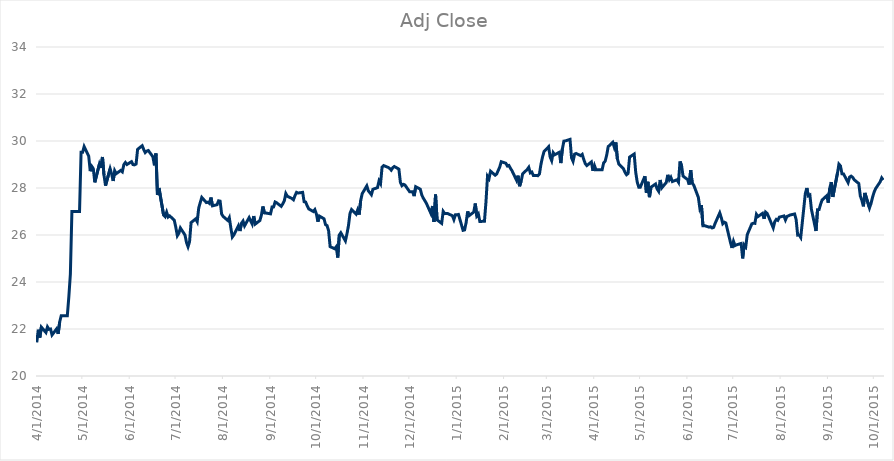
| Category | Adj Close |
|---|---|
| 4/1/14 | 21.43 |
| 4/2/14 | 21.97 |
| 4/3/14 | 21.635 |
| 4/4/14 | 22.08 |
| 4/7/14 | 21.85 |
| 4/8/14 | 22.09 |
| 4/9/14 | 21.985 |
| 4/10/14 | 22 |
| 4/11/14 | 21.745 |
| 4/14/14 | 22.005 |
| 4/15/14 | 21.795 |
| 4/16/14 | 22.3 |
| 4/17/14 | 22.565 |
| 4/18/14 | 22.565 |
| 4/21/14 | 22.565 |
| 4/22/14 | 23.375 |
| 4/23/14 | 24.34 |
| 4/24/14 | 27 |
| 4/25/14 | 27 |
| 4/28/14 | 27 |
| 4/29/14 | 27 |
| 4/30/14 | 29.52 |
| 5/1/14 | 29.52 |
| 5/2/14 | 29.76 |
| 5/5/14 | 29.355 |
| 5/6/14 | 28.715 |
| 5/7/14 | 28.92 |
| 5/8/14 | 28.825 |
| 5/9/14 | 28.24 |
| 5/12/14 | 29.02 |
| 5/13/14 | 28.85 |
| 5/14/14 | 29.32 |
| 5/15/14 | 28.55 |
| 5/16/14 | 28.1 |
| 5/19/14 | 28.82 |
| 5/20/14 | 28.595 |
| 5/21/14 | 28.3 |
| 5/22/14 | 28.735 |
| 5/23/14 | 28.61 |
| 5/26/14 | 28.75 |
| 5/27/14 | 28.69 |
| 5/28/14 | 28.995 |
| 5/29/14 | 29.085 |
| 5/30/14 | 29 |
| 6/2/14 | 29.12 |
| 6/3/14 | 28.995 |
| 6/4/14 | 28.985 |
| 6/5/14 | 29.02 |
| 6/6/14 | 29.645 |
| 6/9/14 | 29.8 |
| 6/10/14 | 29.64 |
| 6/11/14 | 29.505 |
| 6/12/14 | 29.57 |
| 6/13/14 | 29.595 |
| 6/16/14 | 29.33 |
| 6/17/14 | 28.965 |
| 6/18/14 | 29.47 |
| 6/19/14 | 27.7 |
| 6/20/14 | 28 |
| 6/23/14 | 26.85 |
| 6/24/14 | 26.78 |
| 6/25/14 | 26.97 |
| 6/26/14 | 26.765 |
| 6/27/14 | 26.815 |
| 6/30/14 | 26.625 |
| 7/1/14 | 26.33 |
| 7/2/14 | 25.97 |
| 7/3/14 | 26.075 |
| 7/4/14 | 26.3 |
| 7/7/14 | 26 |
| 7/8/14 | 25.68 |
| 7/9/14 | 25.5 |
| 7/10/14 | 25.715 |
| 7/11/14 | 26.53 |
| 7/14/14 | 26.685 |
| 7/15/14 | 26.565 |
| 7/16/14 | 27.15 |
| 7/17/14 | 27.38 |
| 7/18/14 | 27.6 |
| 7/21/14 | 27.38 |
| 7/22/14 | 27.395 |
| 7/23/14 | 27.345 |
| 7/24/14 | 27.595 |
| 7/25/14 | 27.24 |
| 7/28/14 | 27.29 |
| 7/29/14 | 27.455 |
| 7/30/14 | 27.44 |
| 7/31/14 | 26.89 |
| 8/1/14 | 26.79 |
| 8/4/14 | 26.62 |
| 8/5/14 | 26.74 |
| 8/6/14 | 26.315 |
| 8/7/14 | 25.915 |
| 8/8/14 | 26.005 |
| 8/11/14 | 26.395 |
| 8/12/14 | 26.17 |
| 8/13/14 | 26.5 |
| 8/14/14 | 26.595 |
| 8/15/14 | 26.39 |
| 8/18/14 | 26.74 |
| 8/19/14 | 26.6 |
| 8/20/14 | 26.465 |
| 8/21/14 | 26.805 |
| 8/22/14 | 26.465 |
| 8/25/14 | 26.615 |
| 8/26/14 | 26.84 |
| 8/27/14 | 27.215 |
| 8/28/14 | 26.94 |
| 8/29/14 | 26.935 |
| 9/1/14 | 26.9 |
| 9/2/14 | 27.19 |
| 9/3/14 | 27.195 |
| 9/4/14 | 27.405 |
| 9/5/14 | 27.37 |
| 9/8/14 | 27.22 |
| 9/9/14 | 27.325 |
| 9/10/14 | 27.45 |
| 9/11/14 | 27.765 |
| 9/12/14 | 27.65 |
| 9/15/14 | 27.555 |
| 9/16/14 | 27.5 |
| 9/17/14 | 27.675 |
| 9/18/14 | 27.815 |
| 9/19/14 | 27.785 |
| 9/22/14 | 27.815 |
| 9/23/14 | 27.415 |
| 9/24/14 | 27.4 |
| 9/25/14 | 27.24 |
| 9/26/14 | 27.11 |
| 9/29/14 | 27 |
| 9/30/14 | 27.08 |
| 10/1/14 | 26.9 |
| 10/2/14 | 26.565 |
| 10/3/14 | 26.805 |
| 10/6/14 | 26.69 |
| 10/7/14 | 26.44 |
| 10/8/14 | 26.4 |
| 10/9/14 | 26.185 |
| 10/10/14 | 25.505 |
| 10/13/14 | 25.415 |
| 10/14/14 | 25.5 |
| 10/15/14 | 25.04 |
| 10/16/14 | 26 |
| 10/17/14 | 26.095 |
| 10/20/14 | 25.75 |
| 10/21/14 | 26.045 |
| 10/22/14 | 26.395 |
| 10/23/14 | 26.915 |
| 10/24/14 | 27.08 |
| 10/27/14 | 26.885 |
| 10/28/14 | 27.065 |
| 10/29/14 | 26.87 |
| 10/30/14 | 27.47 |
| 10/31/14 | 27.76 |
| 11/3/14 | 28.09 |
| 11/4/14 | 27.88 |
| 11/5/14 | 27.8 |
| 11/6/14 | 27.715 |
| 11/7/14 | 27.945 |
| 11/10/14 | 28.015 |
| 11/11/14 | 28.3 |
| 11/12/14 | 28.185 |
| 11/13/14 | 28.89 |
| 11/14/14 | 28.955 |
| 11/17/14 | 28.875 |
| 11/18/14 | 28.83 |
| 11/19/14 | 28.76 |
| 11/20/14 | 28.865 |
| 11/21/14 | 28.915 |
| 11/24/14 | 28.805 |
| 11/25/14 | 28.235 |
| 11/26/14 | 28.1 |
| 11/27/14 | 28.155 |
| 11/28/14 | 28.125 |
| 12/1/14 | 27.845 |
| 12/2/14 | 27.845 |
| 12/3/14 | 27.84 |
| 12/4/14 | 27.655 |
| 12/5/14 | 28.055 |
| 12/8/14 | 27.95 |
| 12/9/14 | 27.7 |
| 12/10/14 | 27.565 |
| 12/11/14 | 27.46 |
| 12/12/14 | 27.35 |
| 12/15/14 | 26.91 |
| 12/16/14 | 27.235 |
| 12/17/14 | 26.555 |
| 12/18/14 | 27.72 |
| 12/19/14 | 26.645 |
| 12/22/14 | 26.495 |
| 12/23/14 | 27.005 |
| 12/24/14 | 26.91 |
| 12/25/14 | 26.91 |
| 12/26/14 | 26.91 |
| 12/29/14 | 26.82 |
| 12/30/14 | 26.655 |
| 12/31/14 | 26.86 |
| 1/1/15 | 26.86 |
| 1/2/15 | 26.875 |
| 1/5/15 | 26.2 |
| 1/6/15 | 26.215 |
| 1/7/15 | 26.525 |
| 1/8/15 | 27.005 |
| 1/9/15 | 26.825 |
| 1/12/15 | 26.975 |
| 1/13/15 | 27.34 |
| 1/14/15 | 26.81 |
| 1/15/15 | 26.895 |
| 1/16/15 | 26.575 |
| 1/19/15 | 26.585 |
| 1/20/15 | 27.41 |
| 1/21/15 | 28.5 |
| 1/22/15 | 28.4 |
| 1/23/15 | 28.715 |
| 1/26/15 | 28.545 |
| 1/27/15 | 28.595 |
| 1/28/15 | 28.745 |
| 1/29/15 | 28.89 |
| 1/30/15 | 29.12 |
| 2/2/15 | 29.055 |
| 2/3/15 | 28.935 |
| 2/4/15 | 28.96 |
| 2/5/15 | 28.84 |
| 2/6/15 | 28.74 |
| 2/9/15 | 28.33 |
| 2/10/15 | 28.525 |
| 2/11/15 | 28.075 |
| 2/12/15 | 28.285 |
| 2/13/15 | 28.6 |
| 2/16/15 | 28.79 |
| 2/17/15 | 28.88 |
| 2/18/15 | 28.645 |
| 2/19/15 | 28.68 |
| 2/20/15 | 28.535 |
| 2/23/15 | 28.525 |
| 2/24/15 | 28.6 |
| 2/25/15 | 29.015 |
| 2/26/15 | 29.315 |
| 2/27/15 | 29.55 |
| 3/2/15 | 29.755 |
| 3/3/15 | 29.32 |
| 3/4/15 | 29.165 |
| 3/5/15 | 29.505 |
| 3/6/15 | 29.415 |
| 3/9/15 | 29.52 |
| 3/10/15 | 29.06 |
| 3/11/15 | 29.665 |
| 3/12/15 | 29.995 |
| 3/13/15 | 30.005 |
| 3/16/15 | 30.07 |
| 3/17/15 | 29.285 |
| 3/18/15 | 29.135 |
| 3/19/15 | 29.44 |
| 3/20/15 | 29.47 |
| 3/23/15 | 29.375 |
| 3/24/15 | 29.43 |
| 3/25/15 | 29.215 |
| 3/26/15 | 29.035 |
| 3/27/15 | 28.955 |
| 3/30/15 | 29.11 |
| 3/31/15 | 28.73 |
| 4/1/15 | 28.955 |
| 4/2/15 | 28.775 |
| 4/3/15 | 28.775 |
| 4/6/15 | 28.775 |
| 4/7/15 | 29.065 |
| 4/8/15 | 29.14 |
| 4/9/15 | 29.395 |
| 4/10/15 | 29.76 |
| 4/13/15 | 29.945 |
| 4/14/15 | 29.73 |
| 4/15/15 | 29.94 |
| 4/16/15 | 29.24 |
| 4/17/15 | 29.01 |
| 4/20/15 | 28.815 |
| 4/21/15 | 28.665 |
| 4/22/15 | 28.565 |
| 4/23/15 | 28.62 |
| 4/24/15 | 29.315 |
| 4/27/15 | 29.445 |
| 4/28/15 | 28.67 |
| 4/29/15 | 28.25 |
| 4/30/15 | 28.035 |
| 5/1/15 | 28.035 |
| 5/4/15 | 28.5 |
| 5/5/15 | 27.8 |
| 5/6/15 | 28.265 |
| 5/7/15 | 27.61 |
| 5/8/15 | 28.035 |
| 5/11/15 | 28.17 |
| 5/12/15 | 27.96 |
| 5/13/15 | 27.86 |
| 5/14/15 | 28.34 |
| 5/15/15 | 28 |
| 5/18/15 | 28.235 |
| 5/19/15 | 28.56 |
| 5/20/15 | 28.35 |
| 5/21/15 | 28.455 |
| 5/22/15 | 28.275 |
| 5/25/15 | 28.35 |
| 5/26/15 | 28.245 |
| 5/27/15 | 29.13 |
| 5/28/15 | 28.95 |
| 5/29/15 | 28.505 |
| 6/1/15 | 28.355 |
| 6/2/15 | 28.145 |
| 6/3/15 | 28.76 |
| 6/4/15 | 28.2 |
| 6/5/15 | 28.12 |
| 6/8/15 | 27.6 |
| 6/9/15 | 27.13 |
| 6/10/15 | 27.275 |
| 6/11/15 | 26.395 |
| 6/12/15 | 26.4 |
| 6/15/15 | 26.335 |
| 6/16/15 | 26.35 |
| 6/17/15 | 26.3 |
| 6/18/15 | 26.325 |
| 6/19/15 | 26.5 |
| 6/22/15 | 26.94 |
| 6/23/15 | 26.74 |
| 6/24/15 | 26.48 |
| 6/25/15 | 26.545 |
| 6/26/15 | 26.51 |
| 6/29/15 | 25.69 |
| 6/30/15 | 25.45 |
| 7/1/15 | 25.73 |
| 7/2/15 | 25.55 |
| 7/3/15 | 25.58 |
| 7/6/15 | 25.64 |
| 7/7/15 | 25.005 |
| 7/8/15 | 25.575 |
| 7/9/15 | 25.495 |
| 7/10/15 | 26.015 |
| 7/13/15 | 26.475 |
| 7/14/15 | 26.5 |
| 7/15/15 | 26.495 |
| 7/16/15 | 26.88 |
| 7/17/15 | 26.785 |
| 7/20/15 | 26.92 |
| 7/21/15 | 26.69 |
| 7/22/15 | 26.975 |
| 7/23/15 | 26.92 |
| 7/24/15 | 26.775 |
| 7/27/15 | 26.305 |
| 7/28/15 | 26.565 |
| 7/29/15 | 26.665 |
| 7/30/15 | 26.625 |
| 7/31/15 | 26.76 |
| 8/3/15 | 26.81 |
| 8/4/15 | 26.64 |
| 8/5/15 | 26.79 |
| 8/6/15 | 26.815 |
| 8/7/15 | 26.85 |
| 8/10/15 | 26.895 |
| 8/11/15 | 26.655 |
| 8/12/15 | 25.995 |
| 8/13/15 | 26 |
| 8/14/15 | 25.895 |
| 8/17/15 | 27.76 |
| 8/18/15 | 28 |
| 8/19/15 | 27.665 |
| 8/20/15 | 27.7 |
| 8/21/15 | 27.09 |
| 8/24/15 | 26.17 |
| 8/25/15 | 27.075 |
| 8/26/15 | 27.08 |
| 8/27/15 | 27.31 |
| 8/28/15 | 27.49 |
| 8/31/15 | 27.67 |
| 9/1/15 | 27.375 |
| 9/2/15 | 27.995 |
| 9/3/15 | 28.25 |
| 9/4/15 | 27.62 |
| 9/7/15 | 28.615 |
| 9/8/15 | 29.015 |
| 9/9/15 | 28.94 |
| 9/10/15 | 28.605 |
| 9/11/15 | 28.6 |
| 9/14/15 | 28.23 |
| 9/15/15 | 28.465 |
| 9/16/15 | 28.505 |
| 9/17/15 | 28.455 |
| 9/18/15 | 28.35 |
| 9/21/15 | 28.19 |
| 9/22/15 | 27.66 |
| 9/23/15 | 27.48 |
| 9/24/15 | 27.22 |
| 9/25/15 | 27.79 |
| 9/28/15 | 27.15 |
| 9/29/15 | 27.34 |
| 9/30/15 | 27.605 |
| 10/1/15 | 27.82 |
| 10/2/15 | 27.97 |
| 10/5/15 | 28.265 |
| 10/6/15 | 28.43 |
| 10/7/15 | 28.34 |